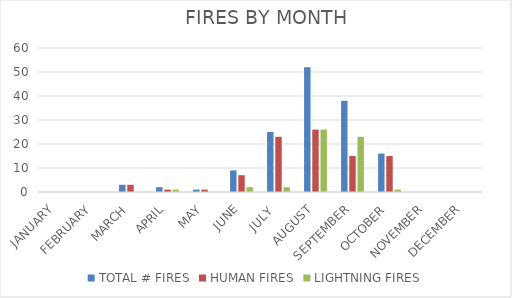
| Category | TOTAL # FIRES | HUMAN FIRES | LIGHTNING FIRES |
|---|---|---|---|
| JANUARY | 0 | 0 | 0 |
| FEBRUARY | 0 | 0 | 0 |
| MARCH | 3 | 3 | 0 |
| APRIL | 2 | 1 | 1 |
| MAY | 1 | 1 | 0 |
| JUNE | 9 | 7 | 2 |
| JULY  | 25 | 23 | 2 |
| AUGUST | 52 | 26 | 26 |
| SEPTEMBER | 38 | 15 | 23 |
| OCTOBER | 16 | 15 | 1 |
| NOVEMBER | 0 | 0 | 0 |
| DECEMBER | 0 | 0 | 0 |